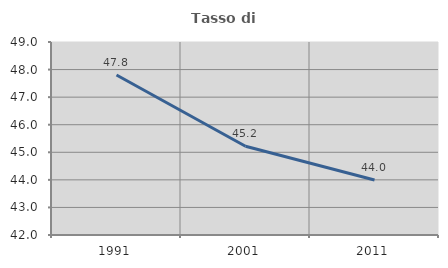
| Category | Tasso di occupazione   |
|---|---|
| 1991.0 | 47.805 |
| 2001.0 | 45.219 |
| 2011.0 | 43.993 |